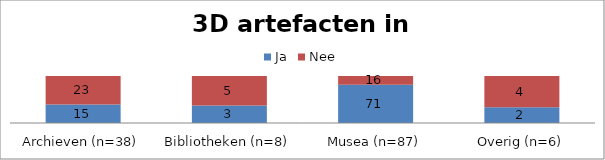
| Category | Ja | Nee |
|---|---|---|
| Archieven (n=38) | 15 | 23 |
| Bibliotheken (n=8) | 3 | 5 |
| Musea (n=87) | 71 | 16 |
| Overig (n=6) | 2 | 4 |